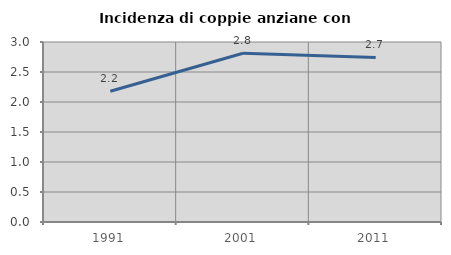
| Category | Incidenza di coppie anziane con figli |
|---|---|
| 1991.0 | 2.18 |
| 2001.0 | 2.812 |
| 2011.0 | 2.743 |